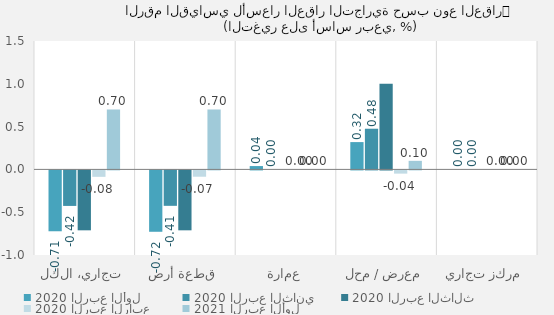
| Category | 2020 | 2021 |
|---|---|---|
| تجاري، الكل | -0.075 | 0.7 |
| قطعة أرض | -0.074 | 0.7 |
| عمارة | 0 | 0 |
| معرض / محل | -0.038 | 0.1 |
| مركز تجاري | 0 | 0 |